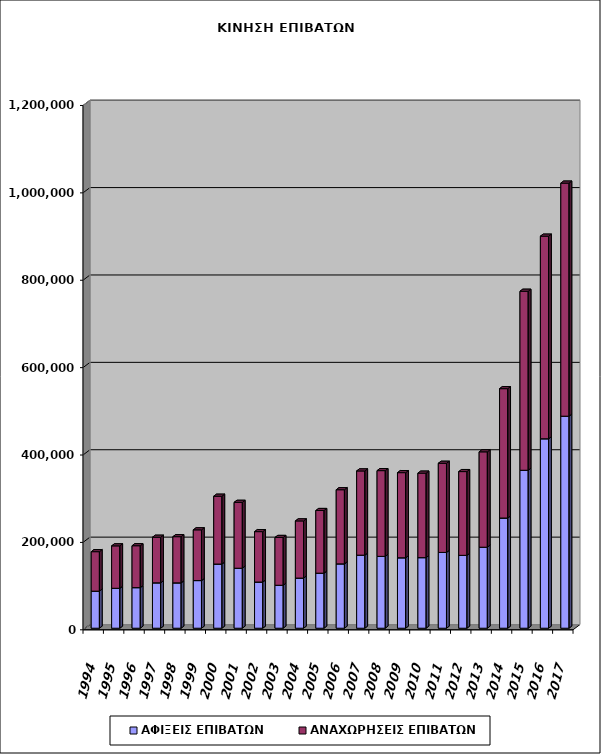
| Category | ΑΦΙΞΕΙΣ ΕΠΙΒΑΤΩΝ | ΑΝΑΧΩΡΗΣΕΙΣ ΕΠΙΒΑΤΩΝ |
|---|---|---|
| 1994.0 | 84825 | 90327 |
| 1995.0 | 91425 | 97036 |
| 1996.0 | 92893 | 95885 |
| 1997.0 | 103896 | 104299 |
| 1998.0 | 103817 | 105688 |
| 1999.0 | 109042 | 116118 |
| 2000.0 | 146885 | 155187 |
| 2001.0 | 137314 | 150770 |
| 2002.0 | 105704 | 115336 |
| 2003.0 | 98301 | 109394 |
| 2004.0 | 114742 | 130835 |
| 2005.0 | 126006 | 143365 |
| 2006.0 | 147322 | 169651 |
| 2007.0 | 167242 | 192708 |
| 2008.0 | 164483 | 196187 |
| 2009.0 | 161220 | 194820 |
| 2010.0 | 161553 | 193319 |
| 2011.0 | 173496 | 203977 |
| 2012.0 | 166786 | 191682 |
| 2013.0 | 185378 | 218309 |
| 2014.0 | 252223 | 296051 |
| 2015.0 | 361525 | 409668 |
| 2016.0 | 433598 | 463633 |
| 2017.0 | 485286 | 533351 |